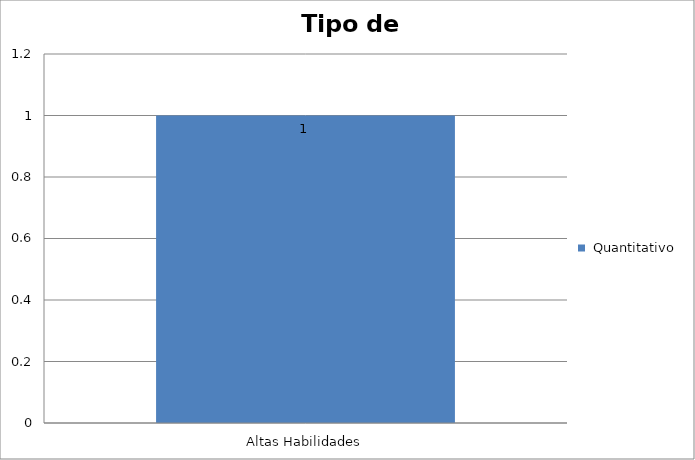
| Category |  Quantitativo |
|---|---|
| Altas Habilidades | 1 |